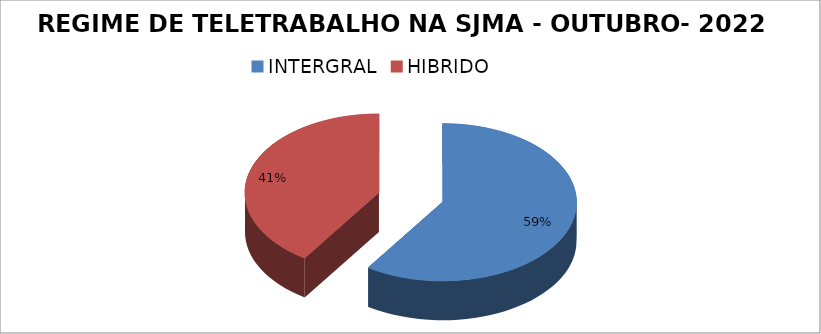
| Category | Series 0 |
|---|---|
| INTERGRAL | 73 |
| HIBRIDO | 50 |